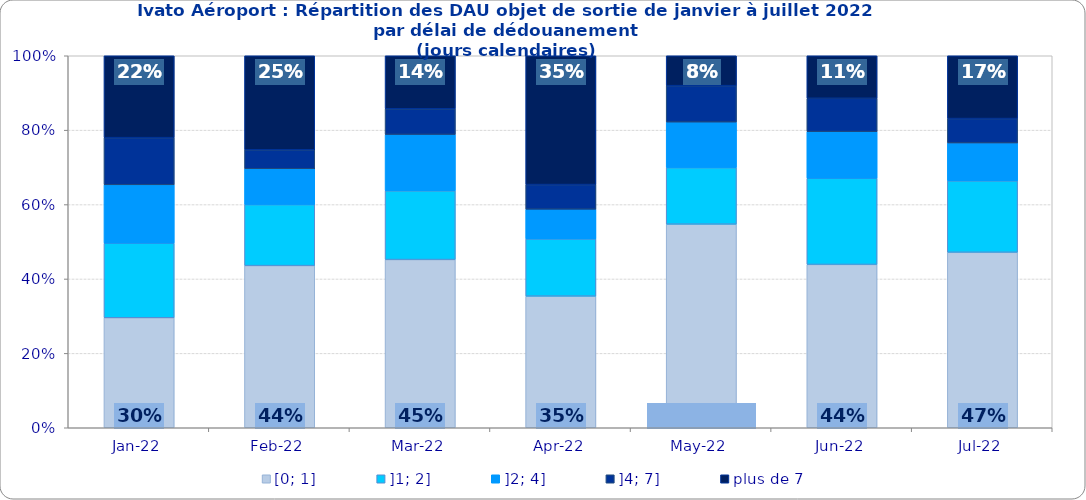
| Category | [0; 1] | ]1; 2] | ]2; 4] | ]4; 7] | plus de 7 |
|---|---|---|---|---|---|
| 2022-01-01 | 0.296 | 0.201 | 0.157 | 0.127 | 0.22 |
| 2022-02-01 | 0.436 | 0.164 | 0.096 | 0.051 | 0.253 |
| 2022-03-01 | 0.452 | 0.185 | 0.151 | 0.069 | 0.143 |
| 2022-04-01 | 0.354 | 0.154 | 0.08 | 0.066 | 0.346 |
| 2022-05-01 | 0.547 | 0.152 | 0.122 | 0.098 | 0.08 |
| 2022-06-01 | 0.439 | 0.232 | 0.125 | 0.09 | 0.114 |
| 2022-07-01 | 0.472 | 0.192 | 0.102 | 0.066 | 0.169 |